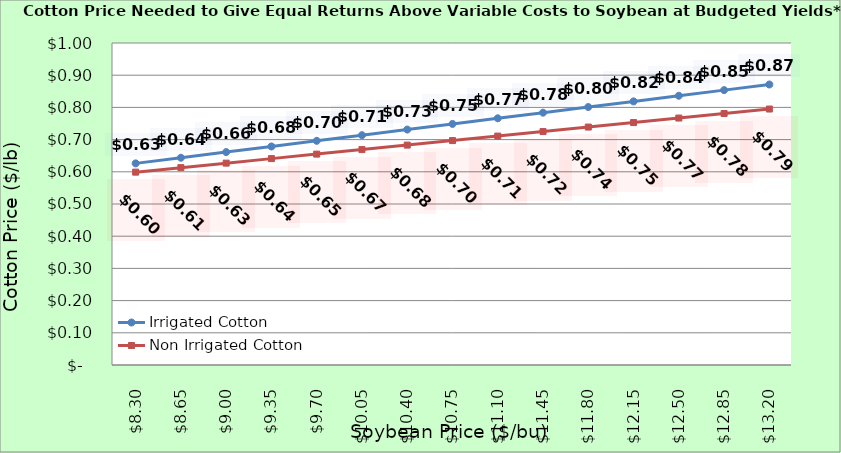
| Category | Irrigated Cotton | Non Irrigated Cotton |
|---|---|---|
| 8.300000000000002 | 0.626 | 0.599 |
| 8.650000000000002 | 0.644 | 0.613 |
| 9.000000000000002 | 0.661 | 0.627 |
| 9.350000000000001 | 0.679 | 0.641 |
| 9.700000000000001 | 0.696 | 0.655 |
| 10.05 | 0.714 | 0.669 |
| 10.4 | 0.731 | 0.683 |
| 10.75 | 0.749 | 0.697 |
| 11.1 | 0.766 | 0.711 |
| 11.45 | 0.784 | 0.725 |
| 11.799999999999999 | 0.801 | 0.739 |
| 12.149999999999999 | 0.819 | 0.753 |
| 12.499999999999998 | 0.836 | 0.767 |
| 12.849999999999998 | 0.854 | 0.781 |
| 13.199999999999998 | 0.871 | 0.795 |